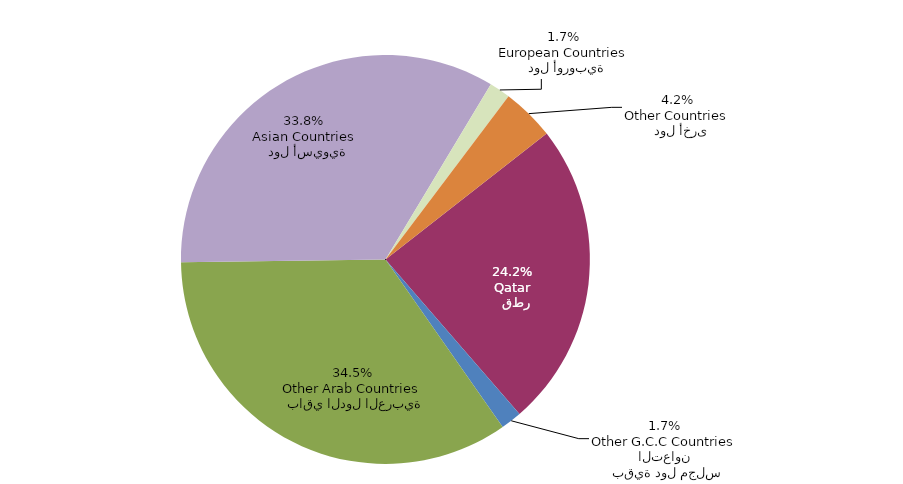
| Category | Series 0 |
|---|---|
|   قطر
Qatar | 1543 |
|   بقية دول مجلس التعاون
Other G.C.C Countries | 106 |
|   باقي الدول العربية
Other Arab Countries | 2201 |
|   دول أسيوية
Asian Countries | 2158 |
|   دول أوروبية
European Countries | 106 |
|   دول أخرى
Other Countries | 266 |